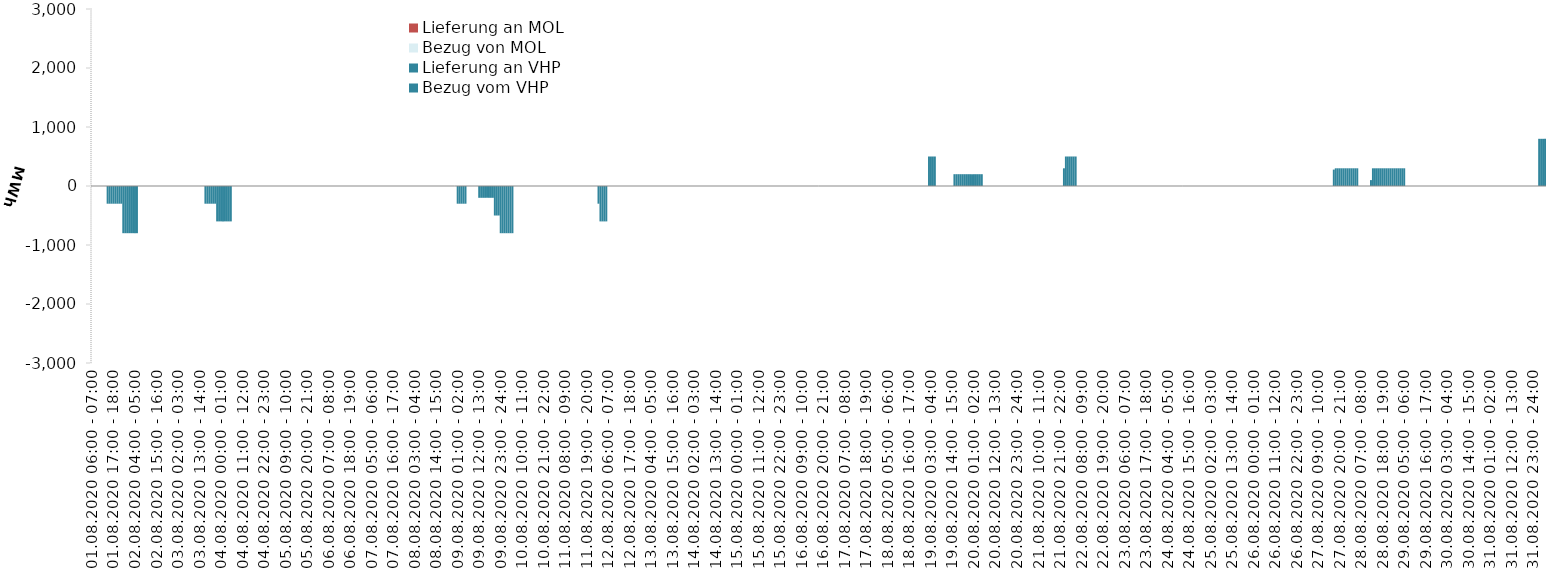
| Category | Bezug vom VHP | Lieferung an VHP | Bezug von MOL | Lieferung an MOL |
|---|---|---|---|---|
| 01.08.2020 06:00 - 07:00 | 0 | 0 | 0 | 0 |
| 01.08.2020 07:00 - 08:00 | 0 | 0 | 0 | 0 |
| 01.08.2020 08:00 - 09:00 | 0 | 0 | 0 | 0 |
| 01.08.2020 09:00 - 10:00 | 0 | 0 | 0 | 0 |
| 01.08.2020 10:00 - 11:00 | 0 | 0 | 0 | 0 |
| 01.08.2020 11:00 - 12:00 | 0 | 0 | 0 | 0 |
| 01.08.2020 12:00 - 13:00 | 0 | 0 | 0 | 0 |
| 01.08.2020 13:00 - 14:00 | 0 | 0 | 0 | 0 |
| 01.08.2020 14:00 - 15:00 | 0 | -300 | 0 | 0 |
| 01.08.2020 15:00 - 16:00 | 0 | -300 | 0 | 0 |
| 01.08.2020 16:00 - 17:00 | 0 | -300 | 0 | 0 |
| 01.08.2020 17:00 - 18:00 | 0 | -300 | 0 | 0 |
| 01.08.2020 18:00 - 19:00 | 0 | -300 | 0 | 0 |
| 01.08.2020 19:00 - 20:00 | 0 | -300 | 0 | 0 |
| 01.08.2020 20:00 - 21:00 | 0 | -300 | 0 | 0 |
| 01.08.2020 21:00 - 22:00 | 0 | -300 | 0 | 0 |
| 01.08.2020 22:00 - 23:00 | 0 | -800 | 0 | 0 |
| 01.08.2020 23:00 - 24:00 | 0 | -800 | 0 | 0 |
| 02.08.2020 00:00 - 01:00 | 0 | -800 | 0 | 0 |
| 02.08.2020 01:00 - 02:00 | 0 | -800 | 0 | 0 |
| 02.08.2020 02:00 - 03:00 | 0 | -800 | 0 | 0 |
| 02.08.2020 03:00 - 04:00 | 0 | -800 | 0 | 0 |
| 02.08.2020 04:00 - 05:00 | 0 | -800 | 0 | 0 |
| 02.08.2020 05:00 - 06:00 | 0 | -800 | 0 | 0 |
| 02.08.2020 06:00 - 07:00 | 0 | 0 | 0 | 0 |
| 02.08.2020 07:00 - 08:00 | 0 | 0 | 0 | 0 |
| 02.08.2020 08:00 - 09:00 | 0 | 0 | 0 | 0 |
| 02.08.2020 09:00 - 10:00 | 0 | 0 | 0 | 0 |
| 02.08.2020 10:00 - 11:00 | 0 | 0 | 0 | 0 |
| 02.08.2020 11:00 - 12:00 | 0 | 0 | 0 | 0 |
| 02.08.2020 12:00 - 13:00 | 0 | 0 | 0 | 0 |
| 02.08.2020 13:00 - 14:00 | 0 | 0 | 0 | 0 |
| 02.08.2020 14:00 - 15:00 | 0 | 0 | 0 | 0 |
| 02.08.2020 15:00 - 16:00 | 0 | 0 | 0 | 0 |
| 02.08.2020 16:00 - 17:00 | 0 | 0 | 0 | 0 |
| 02.08.2020 17:00 - 18:00 | 0 | 0 | 0 | 0 |
| 02.08.2020 18:00 - 19:00 | 0 | 0 | 0 | 0 |
| 02.08.2020 19:00 - 20:00 | 0 | 0 | 0 | 0 |
| 02.08.2020 20:00 - 21:00 | 0 | 0 | 0 | 0 |
| 02.08.2020 21:00 - 22:00 | 0 | 0 | 0 | 0 |
| 02.08.2020 22:00 - 23:00 | 0 | 0 | 0 | 0 |
| 02.08.2020 23:00 - 24:00 | 0 | 0 | 0 | 0 |
| 03.08.2020 00:00 - 01:00 | 0 | 0 | 0 | 0 |
| 03.08.2020 01:00 - 02:00 | 0 | 0 | 0 | 0 |
| 03.08.2020 02:00 - 03:00 | 0 | 0 | 0 | 0 |
| 03.08.2020 03:00 - 04:00 | 0 | 0 | 0 | 0 |
| 03.08.2020 04:00 - 05:00 | 0 | 0 | 0 | 0 |
| 03.08.2020 05:00 - 06:00 | 0 | 0 | 0 | 0 |
| 03.08.2020 06:00 - 07:00 | 0 | 0 | 0 | 0 |
| 03.08.2020 07:00 - 08:00 | 0 | 0 | 0 | 0 |
| 03.08.2020 08:00 - 09:00 | 0 | 0 | 0 | 0 |
| 03.08.2020 09:00 - 10:00 | 0 | 0 | 0 | 0 |
| 03.08.2020 10:00 - 11:00 | 0 | 0 | 0 | 0 |
| 03.08.2020 11:00 - 12:00 | 0 | 0 | 0 | 0 |
| 03.08.2020 12:00 - 13:00 | 0 | 0 | 0 | 0 |
| 03.08.2020 13:00 - 14:00 | 0 | 0 | 0 | 0 |
| 03.08.2020 14:00 - 15:00 | 0 | 0 | 0 | 0 |
| 03.08.2020 15:00 - 16:00 | 0 | 0 | 0 | 0 |
| 03.08.2020 16:00 - 17:00 | 0 | -300 | 0 | 0 |
| 03.08.2020 17:00 - 18:00 | 0 | -300 | 0 | 0 |
| 03.08.2020 18:00 - 19:00 | 0 | -300 | 0 | 0 |
| 03.08.2020 19:00 - 20:00 | 0 | -300 | 0 | 0 |
| 03.08.2020 20:00 - 21:00 | 0 | -300 | 0 | 0 |
| 03.08.2020 21:00 - 22:00 | 0 | -300 | 0 | 0 |
| 03.08.2020 22:00 - 23:00 | 0 | -600 | 0 | 0 |
| 03.08.2020 23:00 - 24:00 | 0 | -600 | 0 | 0 |
| 04.08.2020 00:00 - 01:00 | 0 | -600 | 0 | 0 |
| 04.08.2020 01:00 - 02:00 | 0 | -600 | 0 | 0 |
| 04.08.2020 02:00 - 03:00 | 0 | -600 | 0 | 0 |
| 04.08.2020 03:00 - 04:00 | 0 | -600 | 0 | 0 |
| 04.08.2020 04:00 - 05:00 | 0 | -600 | 0 | 0 |
| 04.08.2020 05:00 - 06:00 | 0 | -600 | 0 | 0 |
| 04.08.2020 06:00 - 07:00 | 0 | 0 | 0 | 0 |
| 04.08.2020 07:00 - 08:00 | 0 | 0 | 0 | 0 |
| 04.08.2020 08:00 - 09:00 | 0 | 0 | 0 | 0 |
| 04.08.2020 09:00 - 10:00 | 0 | 0 | 0 | 0 |
| 04.08.2020 10:00 - 11:00 | 0 | 0 | 0 | 0 |
| 04.08.2020 11:00 - 12:00 | 0 | 0 | 0 | 0 |
| 04.08.2020 12:00 - 13:00 | 0 | 0 | 0 | 0 |
| 04.08.2020 13:00 - 14:00 | 0 | 0 | 0 | 0 |
| 04.08.2020 14:00 - 15:00 | 0 | 0 | 0 | 0 |
| 04.08.2020 15:00 - 16:00 | 0 | 0 | 0 | 0 |
| 04.08.2020 16:00 - 17:00 | 0 | 0 | 0 | 0 |
| 04.08.2020 17:00 - 18:00 | 0 | 0 | 0 | 0 |
| 04.08.2020 18:00 - 19:00 | 0 | 0 | 0 | 0 |
| 04.08.2020 19:00 - 20:00 | 0 | 0 | 0 | 0 |
| 04.08.2020 20:00 - 21:00 | 0 | 0 | 0 | 0 |
| 04.08.2020 21:00 - 22:00 | 0 | 0 | 0 | 0 |
| 04.08.2020 22:00 - 23:00 | 0 | 0 | 0 | 0 |
| 04.08.2020 23:00 - 24:00 | 0 | 0 | 0 | 0 |
| 05.08.2020 00:00 - 01:00 | 0 | 0 | 0 | 0 |
| 05.08.2020 01:00 - 02:00 | 0 | 0 | 0 | 0 |
| 05.08.2020 02:00 - 03:00 | 0 | 0 | 0 | 0 |
| 05.08.2020 03:00 - 04:00 | 0 | 0 | 0 | 0 |
| 05.08.2020 04:00 - 05:00 | 0 | 0 | 0 | 0 |
| 05.08.2020 05:00 - 06:00 | 0 | 0 | 0 | 0 |
| 05.08.2020 06:00 - 07:00 | 0 | 0 | 0 | 0 |
| 05.08.2020 07:00 - 08:00 | 0 | 0 | 0 | 0 |
| 05.08.2020 08:00 - 09:00 | 0 | 0 | 0 | 0 |
| 05.08.2020 09:00 - 10:00 | 0 | 0 | 0 | 0 |
| 05.08.2020 10:00 - 11:00 | 0 | 0 | 0 | 0 |
| 05.08.2020 11:00 - 12:00 | 0 | 0 | 0 | 0 |
| 05.08.2020 12:00 - 13:00 | 0 | 0 | 0 | 0 |
| 05.08.2020 13:00 - 14:00 | 0 | 0 | 0 | 0 |
| 05.08.2020 14:00 - 15:00 | 0 | 0 | 0 | 0 |
| 05.08.2020 15:00 - 16:00 | 0 | 0 | 0 | 0 |
| 05.08.2020 16:00 - 17:00 | 0 | 0 | 0 | 0 |
| 05.08.2020 17:00 - 18:00 | 0 | 0 | 0 | 0 |
| 05.08.2020 18:00 - 19:00 | 0 | 0 | 0 | 0 |
| 05.08.2020 19:00 - 20:00 | 0 | 0 | 0 | 0 |
| 05.08.2020 20:00 - 21:00 | 0 | 0 | 0 | 0 |
| 05.08.2020 21:00 - 22:00 | 0 | 0 | 0 | 0 |
| 05.08.2020 22:00 - 23:00 | 0 | 0 | 0 | 0 |
| 05.08.2020 23:00 - 24:00 | 0 | 0 | 0 | 0 |
| 06.08.2020 00:00 - 01:00 | 0 | 0 | 0 | 0 |
| 06.08.2020 01:00 - 02:00 | 0 | 0 | 0 | 0 |
| 06.08.2020 02:00 - 03:00 | 0 | 0 | 0 | 0 |
| 06.08.2020 03:00 - 04:00 | 0 | 0 | 0 | 0 |
| 06.08.2020 04:00 - 05:00 | 0 | 0 | 0 | 0 |
| 06.08.2020 05:00 - 06:00 | 0 | 0 | 0 | 0 |
| 06.08.2020 06:00 - 07:00 | 0 | 0 | 0 | 0 |
| 06.08.2020 07:00 - 08:00 | 0 | 0 | 0 | 0 |
| 06.08.2020 08:00 - 09:00 | 0 | 0 | 0 | 0 |
| 06.08.2020 09:00 - 10:00 | 0 | 0 | 0 | 0 |
| 06.08.2020 10:00 - 11:00 | 0 | 0 | 0 | 0 |
| 06.08.2020 11:00 - 12:00 | 0 | 0 | 0 | 0 |
| 06.08.2020 12:00 - 13:00 | 0 | 0 | 0 | 0 |
| 06.08.2020 13:00 - 14:00 | 0 | 0 | 0 | 0 |
| 06.08.2020 14:00 - 15:00 | 0 | 0 | 0 | 0 |
| 06.08.2020 15:00 - 16:00 | 0 | 0 | 0 | 0 |
| 06.08.2020 16:00 - 17:00 | 0 | 0 | 0 | 0 |
| 06.08.2020 17:00 - 18:00 | 0 | 0 | 0 | 0 |
| 06.08.2020 18:00 - 19:00 | 0 | 0 | 0 | 0 |
| 06.08.2020 19:00 - 20:00 | 0 | 0 | 0 | 0 |
| 06.08.2020 20:00 - 21:00 | 0 | 0 | 0 | 0 |
| 06.08.2020 21:00 - 22:00 | 0 | 0 | 0 | 0 |
| 06.08.2020 22:00 - 23:00 | 0 | 0 | 0 | 0 |
| 06.08.2020 23:00 - 24:00 | 0 | 0 | 0 | 0 |
| 07.08.2020 00:00 - 01:00 | 0 | 0 | 0 | 0 |
| 07.08.2020 01:00 - 02:00 | 0 | 0 | 0 | 0 |
| 07.08.2020 02:00 - 03:00 | 0 | 0 | 0 | 0 |
| 07.08.2020 03:00 - 04:00 | 0 | 0 | 0 | 0 |
| 07.08.2020 04:00 - 05:00 | 0 | 0 | 0 | 0 |
| 07.08.2020 05:00 - 06:00 | 0 | 0 | 0 | 0 |
| 07.08.2020 06:00 - 07:00 | 0 | 0 | 0 | 0 |
| 07.08.2020 07:00 - 08:00 | 0 | 0 | 0 | 0 |
| 07.08.2020 08:00 - 09:00 | 0 | 0 | 0 | 0 |
| 07.08.2020 09:00 - 10:00 | 0 | 0 | 0 | 0 |
| 07.08.2020 10:00 - 11:00 | 0 | 0 | 0 | 0 |
| 07.08.2020 11:00 - 12:00 | 0 | 0 | 0 | 0 |
| 07.08.2020 12:00 - 13:00 | 0 | 0 | 0 | 0 |
| 07.08.2020 13:00 - 14:00 | 0 | 0 | 0 | 0 |
| 07.08.2020 14:00 - 15:00 | 0 | 0 | 0 | 0 |
| 07.08.2020 15:00 - 16:00 | 0 | 0 | 0 | 0 |
| 07.08.2020 16:00 - 17:00 | 0 | 0 | 0 | 0 |
| 07.08.2020 17:00 - 18:00 | 0 | 0 | 0 | 0 |
| 07.08.2020 18:00 - 19:00 | 0 | 0 | 0 | 0 |
| 07.08.2020 19:00 - 20:00 | 0 | 0 | 0 | 0 |
| 07.08.2020 20:00 - 21:00 | 0 | 0 | 0 | 0 |
| 07.08.2020 21:00 - 22:00 | 0 | 0 | 0 | 0 |
| 07.08.2020 22:00 - 23:00 | 0 | 0 | 0 | 0 |
| 07.08.2020 23:00 - 24:00 | 0 | 0 | 0 | 0 |
| 08.08.2020 00:00 - 01:00 | 0 | 0 | 0 | 0 |
| 08.08.2020 01:00 - 02:00 | 0 | 0 | 0 | 0 |
| 08.08.2020 02:00 - 03:00 | 0 | 0 | 0 | 0 |
| 08.08.2020 03:00 - 04:00 | 0 | 0 | 0 | 0 |
| 08.08.2020 04:00 - 05:00 | 0 | 0 | 0 | 0 |
| 08.08.2020 05:00 - 06:00 | 0 | 0 | 0 | 0 |
| 08.08.2020 06:00 - 07:00 | 0 | 0 | 0 | 0 |
| 08.08.2020 07:00 - 08:00 | 0 | 0 | 0 | 0 |
| 08.08.2020 08:00 - 09:00 | 0 | 0 | 0 | 0 |
| 08.08.2020 09:00 - 10:00 | 0 | 0 | 0 | 0 |
| 08.08.2020 10:00 - 11:00 | 0 | 0 | 0 | 0 |
| 08.08.2020 11:00 - 12:00 | 0 | 0 | 0 | 0 |
| 08.08.2020 12:00 - 13:00 | 0 | 0 | 0 | 0 |
| 08.08.2020 13:00 - 14:00 | 0 | 0 | 0 | 0 |
| 08.08.2020 14:00 - 15:00 | 0 | 0 | 0 | 0 |
| 08.08.2020 15:00 - 16:00 | 0 | 0 | 0 | 0 |
| 08.08.2020 16:00 - 17:00 | 0 | 0 | 0 | 0 |
| 08.08.2020 17:00 - 18:00 | 0 | 0 | 0 | 0 |
| 08.08.2020 18:00 - 19:00 | 0 | 0 | 0 | 0 |
| 08.08.2020 19:00 - 20:00 | 0 | 0 | 0 | 0 |
| 08.08.2020 20:00 - 21:00 | 0 | 0 | 0 | 0 |
| 08.08.2020 21:00 - 22:00 | 0 | 0 | 0 | 0 |
| 08.08.2020 22:00 - 23:00 | 0 | 0 | 0 | 0 |
| 08.08.2020 23:00 - 24:00 | 0 | 0 | 0 | 0 |
| 09.08.2020 00:00 - 01:00 | 0 | 0 | 0 | 0 |
| 09.08.2020 01:00 - 02:00 | 0 | -300 | 0 | 0 |
| 09.08.2020 02:00 - 03:00 | 0 | -300 | 0 | 0 |
| 09.08.2020 03:00 - 04:00 | 0 | -300 | 0 | 0 |
| 09.08.2020 04:00 - 05:00 | 0 | -300 | 0 | 0 |
| 09.08.2020 05:00 - 06:00 | 0 | -300 | 0 | 0 |
| 09.08.2020 06:00 - 07:00 | 0 | 0 | 0 | 0 |
| 09.08.2020 07:00 - 08:00 | 0 | 0 | 0 | 0 |
| 09.08.2020 08:00 - 09:00 | 0 | 0 | 0 | 0 |
| 09.08.2020 09:00 - 10:00 | 0 | 0 | 0 | 0 |
| 09.08.2020 10:00 - 11:00 | 0 | 0 | 0 | 0 |
| 09.08.2020 11:00 - 12:00 | 0 | 0 | 0 | 0 |
| 09.08.2020 12:00 - 13:00 | 0 | -200 | 0 | 0 |
| 09.08.2020 13:00 - 14:00 | 0 | -200 | 0 | 0 |
| 09.08.2020 14:00 - 15:00 | 0 | -200 | 0 | 0 |
| 09.08.2020 15:00 - 16:00 | 0 | -200 | 0 | 0 |
| 09.08.2020 16:00 - 17:00 | 0 | -200 | 0 | 0 |
| 09.08.2020 17:00 - 18:00 | 0 | -200 | 0 | 0 |
| 09.08.2020 18:00 - 19:00 | 0 | -200 | 0 | 0 |
| 09.08.2020 19:00 - 20:00 | 0 | -200 | 0 | 0 |
| 09.08.2020 20:00 - 21:00 | 0 | -500 | 0 | 0 |
| 09.08.2020 21:00 - 22:00 | 0 | -500 | 0 | 0 |
| 09.08.2020 22:00 - 23:00 | 0 | -500 | 0 | 0 |
| 09.08.2020 23:00 - 24:00 | 0 | -800 | 0 | 0 |
| 10.08.2020 00:00 - 01:00 | 0 | -800 | 0 | 0 |
| 10.08.2020 01:00 - 02:00 | 0 | -800 | 0 | 0 |
| 10.08.2020 02:00 - 03:00 | 0 | -800 | 0 | 0 |
| 10.08.2020 03:00 - 04:00 | 0 | -800 | 0 | 0 |
| 10.08.2020 04:00 - 05:00 | 0 | -800 | 0 | 0 |
| 10.08.2020 05:00 - 06:00 | 0 | -800 | 0 | 0 |
| 10.08.2020 06:00 - 07:00 | 0 | 0 | 0 | 0 |
| 10.08.2020 07:00 - 08:00 | 0 | 0 | 0 | 0 |
| 10.08.2020 08:00 - 09:00 | 0 | 0 | 0 | 0 |
| 10.08.2020 09:00 - 10:00 | 0 | 0 | 0 | 0 |
| 10.08.2020 10:00 - 11:00 | 0 | 0 | 0 | 0 |
| 10.08.2020 11:00 - 12:00 | 0 | 0 | 0 | 0 |
| 10.08.2020 12:00 - 13:00 | 0 | 0 | 0 | 0 |
| 10.08.2020 13:00 - 14:00 | 0 | 0 | 0 | 0 |
| 10.08.2020 14:00 - 15:00 | 0 | 0 | 0 | 0 |
| 10.08.2020 15:00 - 16:00 | 0 | 0 | 0 | 0 |
| 10.08.2020 16:00 - 17:00 | 0 | 0 | 0 | 0 |
| 10.08.2020 17:00 - 18:00 | 0 | 0 | 0 | 0 |
| 10.08.2020 18:00 - 19:00 | 0 | 0 | 0 | 0 |
| 10.08.2020 19:00 - 20:00 | 0 | 0 | 0 | 0 |
| 10.08.2020 20:00 - 21:00 | 0 | 0 | 0 | 0 |
| 10.08.2020 21:00 - 22:00 | 0 | 0 | 0 | 0 |
| 10.08.2020 22:00 - 23:00 | 0 | 0 | 0 | 0 |
| 10.08.2020 23:00 - 24:00 | 0 | 0 | 0 | 0 |
| 11.08.2020 00:00 - 01:00 | 0 | 0 | 0 | 0 |
| 11.08.2020 01:00 - 02:00 | 0 | 0 | 0 | 0 |
| 11.08.2020 02:00 - 03:00 | 0 | 0 | 0 | 0 |
| 11.08.2020 03:00 - 04:00 | 0 | 0 | 0 | 0 |
| 11.08.2020 04:00 - 05:00 | 0 | 0 | 0 | 0 |
| 11.08.2020 05:00 - 06:00 | 0 | 0 | 0 | 0 |
| 11.08.2020 06:00 - 07:00 | 0 | 0 | 0 | 0 |
| 11.08.2020 07:00 - 08:00 | 0 | 0 | 0 | 0 |
| 11.08.2020 08:00 - 09:00 | 0 | 0 | 0 | 0 |
| 11.08.2020 09:00 - 10:00 | 0 | 0 | 0 | 0 |
| 11.08.2020 10:00 - 11:00 | 0 | 0 | 0 | 0 |
| 11.08.2020 11:00 - 12:00 | 0 | 0 | 0 | 0 |
| 11.08.2020 12:00 - 13:00 | 0 | 0 | 0 | 0 |
| 11.08.2020 13:00 - 14:00 | 0 | 0 | 0 | 0 |
| 11.08.2020 14:00 - 15:00 | 0 | 0 | 0 | 0 |
| 11.08.2020 15:00 - 16:00 | 0 | 0 | 0 | 0 |
| 11.08.2020 16:00 - 17:00 | 0 | 0 | 0 | 0 |
| 11.08.2020 17:00 - 18:00 | 0 | 0 | 0 | 0 |
| 11.08.2020 18:00 - 19:00 | 0 | 0 | 0 | 0 |
| 11.08.2020 19:00 - 20:00 | 0 | 0 | 0 | 0 |
| 11.08.2020 20:00 - 21:00 | 0 | 0 | 0 | 0 |
| 11.08.2020 21:00 - 22:00 | 0 | 0 | 0 | 0 |
| 11.08.2020 22:00 - 23:00 | 0 | 0 | 0 | 0 |
| 11.08.2020 23:00 - 24:00 | 0 | 0 | 0 | 0 |
| 12.08.2020 00:00 - 01:00 | 0 | 0 | 0 | 0 |
| 12.08.2020 01:00 - 02:00 | 0 | -300 | 0 | 0 |
| 12.08.2020 02:00 - 03:00 | 0 | -600 | 0 | 0 |
| 12.08.2020 03:00 - 04:00 | 0 | -600 | 0 | 0 |
| 12.08.2020 04:00 - 05:00 | 0 | -600 | 0 | 0 |
| 12.08.2020 05:00 - 06:00 | 0 | -600 | 0 | 0 |
| 12.08.2020 06:00 - 07:00 | 0 | 0 | 0 | 0 |
| 12.08.2020 07:00 - 08:00 | 0 | 0 | 0 | 0 |
| 12.08.2020 08:00 - 09:00 | 0 | 0 | 0 | 0 |
| 12.08.2020 09:00 - 10:00 | 0 | 0 | 0 | 0 |
| 12.08.2020 10:00 - 11:00 | 0 | 0 | 0 | 0 |
| 12.08.2020 11:00 - 12:00 | 0 | 0 | 0 | 0 |
| 12.08.2020 12:00 - 13:00 | 0 | 0 | 0 | 0 |
| 12.08.2020 13:00 - 14:00 | 0 | 0 | 0 | 0 |
| 12.08.2020 14:00 - 15:00 | 0 | 0 | 0 | 0 |
| 12.08.2020 15:00 - 16:00 | 0 | 0 | 0 | 0 |
| 12.08.2020 16:00 - 17:00 | 0 | 0 | 0 | 0 |
| 12.08.2020 17:00 - 18:00 | 0 | 0 | 0 | 0 |
| 12.08.2020 18:00 - 19:00 | 0 | 0 | 0 | 0 |
| 12.08.2020 19:00 - 20:00 | 0 | 0 | 0 | 0 |
| 12.08.2020 20:00 - 21:00 | 0 | 0 | 0 | 0 |
| 12.08.2020 21:00 - 22:00 | 0 | 0 | 0 | 0 |
| 12.08.2020 22:00 - 23:00 | 0 | 0 | 0 | 0 |
| 12.08.2020 23:00 - 24:00 | 0 | 0 | 0 | 0 |
| 13.08.2020 00:00 - 01:00 | 0 | 0 | 0 | 0 |
| 13.08.2020 01:00 - 02:00 | 0 | 0 | 0 | 0 |
| 13.08.2020 02:00 - 03:00 | 0 | 0 | 0 | 0 |
| 13.08.2020 03:00 - 04:00 | 0 | 0 | 0 | 0 |
| 13.08.2020 04:00 - 05:00 | 0 | 0 | 0 | 0 |
| 13.08.2020 05:00 - 06:00 | 0 | 0 | 0 | 0 |
| 13.08.2020 06:00 - 07:00 | 0 | 0 | 0 | 0 |
| 13.08.2020 07:00 - 08:00 | 0 | 0 | 0 | 0 |
| 13.08.2020 08:00 - 09:00 | 0 | 0 | 0 | 0 |
| 13.08.2020 09:00 - 10:00 | 0 | 0 | 0 | 0 |
| 13.08.2020 10:00 - 11:00 | 0 | 0 | 0 | 0 |
| 13.08.2020 11:00 - 12:00 | 0 | 0 | 0 | 0 |
| 13.08.2020 12:00 - 13:00 | 0 | 0 | 0 | 0 |
| 13.08.2020 13:00 - 14:00 | 0 | 0 | 0 | 0 |
| 13.08.2020 14:00 - 15:00 | 0 | 0 | 0 | 0 |
| 13.08.2020 15:00 - 16:00 | 0 | 0 | 0 | 0 |
| 13.08.2020 16:00 - 17:00 | 0 | 0 | 0 | 0 |
| 13.08.2020 17:00 - 18:00 | 0 | 0 | 0 | 0 |
| 13.08.2020 18:00 - 19:00 | 0 | 0 | 0 | 0 |
| 13.08.2020 19:00 - 20:00 | 0 | 0 | 0 | 0 |
| 13.08.2020 20:00 - 21:00 | 0 | 0 | 0 | 0 |
| 13.08.2020 21:00 - 22:00 | 0 | 0 | 0 | 0 |
| 13.08.2020 22:00 - 23:00 | 0 | 0 | 0 | 0 |
| 13.08.2020 23:00 - 24:00 | 0 | 0 | 0 | 0 |
| 14.08.2020 00:00 - 01:00 | 0 | 0 | 0 | 0 |
| 14.08.2020 01:00 - 02:00 | 0 | 0 | 0 | 0 |
| 14.08.2020 02:00 - 03:00 | 0 | 0 | 0 | 0 |
| 14.08.2020 03:00 - 04:00 | 0 | 0 | 0 | 0 |
| 14.08.2020 04:00 - 05:00 | 0 | 0 | 0 | 0 |
| 14.08.2020 05:00 - 06:00 | 0 | 0 | 0 | 0 |
| 14.08.2020 06:00 - 07:00 | 0 | 0 | 0 | 0 |
| 14.08.2020 07:00 - 08:00 | 0 | 0 | 0 | 0 |
| 14.08.2020 08:00 - 09:00 | 0 | 0 | 0 | 0 |
| 14.08.2020 09:00 - 10:00 | 0 | 0 | 0 | 0 |
| 14.08.2020 10:00 - 11:00 | 0 | 0 | 0 | 0 |
| 14.08.2020 11:00 - 12:00 | 0 | 0 | 0 | 0 |
| 14.08.2020 12:00 - 13:00 | 0 | 0 | 0 | 0 |
| 14.08.2020 13:00 - 14:00 | 0 | 0 | 0 | 0 |
| 14.08.2020 14:00 - 15:00 | 0 | 0 | 0 | 0 |
| 14.08.2020 15:00 - 16:00 | 0 | 0 | 0 | 0 |
| 14.08.2020 16:00 - 17:00 | 0 | 0 | 0 | 0 |
| 14.08.2020 17:00 - 18:00 | 0 | 0 | 0 | 0 |
| 14.08.2020 18:00 - 19:00 | 0 | 0 | 0 | 0 |
| 14.08.2020 19:00 - 20:00 | 0 | 0 | 0 | 0 |
| 14.08.2020 20:00 - 21:00 | 0 | 0 | 0 | 0 |
| 14.08.2020 21:00 - 22:00 | 0 | 0 | 0 | 0 |
| 14.08.2020 22:00 - 23:00 | 0 | 0 | 0 | 0 |
| 14.08.2020 23:00 - 24:00 | 0 | 0 | 0 | 0 |
| 15.08.2020 00:00 - 01:00 | 0 | 0 | 0 | 0 |
| 15.08.2020 01:00 - 02:00 | 0 | 0 | 0 | 0 |
| 15.08.2020 02:00 - 03:00 | 0 | 0 | 0 | 0 |
| 15.08.2020 03:00 - 04:00 | 0 | 0 | 0 | 0 |
| 15.08.2020 04:00 - 05:00 | 0 | 0 | 0 | 0 |
| 15.08.2020 05:00 - 06:00 | 0 | 0 | 0 | 0 |
| 15.08.2020 06:00 - 07:00 | 0 | 0 | 0 | 0 |
| 15.08.2020 07:00 - 08:00 | 0 | 0 | 0 | 0 |
| 15.08.2020 08:00 - 09:00 | 0 | 0 | 0 | 0 |
| 15.08.2020 09:00 - 10:00 | 0 | 0 | 0 | 0 |
| 15.08.2020 10:00 - 11:00 | 0 | 0 | 0 | 0 |
| 15.08.2020 11:00 - 12:00 | 0 | 0 | 0 | 0 |
| 15.08.2020 12:00 - 13:00 | 0 | 0 | 0 | 0 |
| 15.08.2020 13:00 - 14:00 | 0 | 0 | 0 | 0 |
| 15.08.2020 14:00 - 15:00 | 0 | 0 | 0 | 0 |
| 15.08.2020 15:00 - 16:00 | 0 | 0 | 0 | 0 |
| 15.08.2020 16:00 - 17:00 | 0 | 0 | 0 | 0 |
| 15.08.2020 17:00 - 18:00 | 0 | 0 | 0 | 0 |
| 15.08.2020 18:00 - 19:00 | 0 | 0 | 0 | 0 |
| 15.08.2020 19:00 - 20:00 | 0 | 0 | 0 | 0 |
| 15.08.2020 20:00 - 21:00 | 0 | 0 | 0 | 0 |
| 15.08.2020 21:00 - 22:00 | 0 | 0 | 0 | 0 |
| 15.08.2020 22:00 - 23:00 | 0 | 0 | 0 | 0 |
| 15.08.2020 23:00 - 24:00 | 0 | 0 | 0 | 0 |
| 16.08.2020 00:00 - 01:00 | 0 | 0 | 0 | 0 |
| 16.08.2020 01:00 - 02:00 | 0 | 0 | 0 | 0 |
| 16.08.2020 02:00 - 03:00 | 0 | 0 | 0 | 0 |
| 16.08.2020 03:00 - 04:00 | 0 | 0 | 0 | 0 |
| 16.08.2020 04:00 - 05:00 | 0 | 0 | 0 | 0 |
| 16.08.2020 05:00 - 06:00 | 0 | 0 | 0 | 0 |
| 16.08.2020 06:00 - 07:00 | 0 | 0 | 0 | 0 |
| 16.08.2020 07:00 - 08:00 | 0 | 0 | 0 | 0 |
| 16.08.2020 08:00 - 09:00 | 0 | 0 | 0 | 0 |
| 16.08.2020 09:00 - 10:00 | 0 | 0 | 0 | 0 |
| 16.08.2020 10:00 - 11:00 | 0 | 0 | 0 | 0 |
| 16.08.2020 11:00 - 12:00 | 0 | 0 | 0 | 0 |
| 16.08.2020 12:00 - 13:00 | 0 | 0 | 0 | 0 |
| 16.08.2020 13:00 - 14:00 | 0 | 0 | 0 | 0 |
| 16.08.2020 14:00 - 15:00 | 0 | 0 | 0 | 0 |
| 16.08.2020 15:00 - 16:00 | 0 | 0 | 0 | 0 |
| 16.08.2020 16:00 - 17:00 | 0 | 0 | 0 | 0 |
| 16.08.2020 17:00 - 18:00 | 0 | 0 | 0 | 0 |
| 16.08.2020 18:00 - 19:00 | 0 | 0 | 0 | 0 |
| 16.08.2020 19:00 - 20:00 | 0 | 0 | 0 | 0 |
| 16.08.2020 20:00 - 21:00 | 0 | 0 | 0 | 0 |
| 16.08.2020 21:00 - 22:00 | 0 | 0 | 0 | 0 |
| 16.08.2020 22:00 - 23:00 | 0 | 0 | 0 | 0 |
| 16.08.2020 23:00 - 24:00 | 0 | 0 | 0 | 0 |
| 17.08.2020 00:00 - 01:00 | 0 | 0 | 0 | 0 |
| 17.08.2020 01:00 - 02:00 | 0 | 0 | 0 | 0 |
| 17.08.2020 02:00 - 03:00 | 0 | 0 | 0 | 0 |
| 17.08.2020 03:00 - 04:00 | 0 | 0 | 0 | 0 |
| 17.08.2020 04:00 - 05:00 | 0 | 0 | 0 | 0 |
| 17.08.2020 05:00 - 06:00 | 0 | 0 | 0 | 0 |
| 17.08.2020 06:00 - 07:00 | 0 | 0 | 0 | 0 |
| 17.08.2020 07:00 - 08:00 | 0 | 0 | 0 | 0 |
| 17.08.2020 08:00 - 09:00 | 0 | 0 | 0 | 0 |
| 17.08.2020 09:00 - 10:00 | 0 | 0 | 0 | 0 |
| 17.08.2020 10:00 - 11:00 | 0 | 0 | 0 | 0 |
| 17.08.2020 11:00 - 12:00 | 0 | 0 | 0 | 0 |
| 17.08.2020 12:00 - 13:00 | 0 | 0 | 0 | 0 |
| 17.08.2020 13:00 - 14:00 | 0 | 0 | 0 | 0 |
| 17.08.2020 14:00 - 15:00 | 0 | 0 | 0 | 0 |
| 17.08.2020 15:00 - 16:00 | 0 | 0 | 0 | 0 |
| 17.08.2020 16:00 - 17:00 | 0 | 0 | 0 | 0 |
| 17.08.2020 17:00 - 18:00 | 0 | 0 | 0 | 0 |
| 17.08.2020 18:00 - 19:00 | 0 | 0 | 0 | 0 |
| 17.08.2020 19:00 - 20:00 | 0 | 0 | 0 | 0 |
| 17.08.2020 20:00 - 21:00 | 0 | 0 | 0 | 0 |
| 17.08.2020 21:00 - 22:00 | 0 | 0 | 0 | 0 |
| 17.08.2020 22:00 - 23:00 | 0 | 0 | 0 | 0 |
| 17.08.2020 23:00 - 24:00 | 0 | 0 | 0 | 0 |
| 18.08.2020 00:00 - 01:00 | 0 | 0 | 0 | 0 |
| 18.08.2020 01:00 - 02:00 | 0 | 0 | 0 | 0 |
| 18.08.2020 02:00 - 03:00 | 0 | 0 | 0 | 0 |
| 18.08.2020 03:00 - 04:00 | 0 | 0 | 0 | 0 |
| 18.08.2020 04:00 - 05:00 | 0 | 0 | 0 | 0 |
| 18.08.2020 05:00 - 06:00 | 0 | 0 | 0 | 0 |
| 18.08.2020 06:00 - 07:00 | 0 | 0 | 0 | 0 |
| 18.08.2020 07:00 - 08:00 | 0 | 0 | 0 | 0 |
| 18.08.2020 08:00 - 09:00 | 0 | 0 | 0 | 0 |
| 18.08.2020 09:00 - 10:00 | 0 | 0 | 0 | 0 |
| 18.08.2020 10:00 - 11:00 | 0 | 0 | 0 | 0 |
| 18.08.2020 11:00 - 12:00 | 0 | 0 | 0 | 0 |
| 18.08.2020 12:00 - 13:00 | 0 | 0 | 0 | 0 |
| 18.08.2020 13:00 - 14:00 | 0 | 0 | 0 | 0 |
| 18.08.2020 14:00 - 15:00 | 0 | 0 | 0 | 0 |
| 18.08.2020 15:00 - 16:00 | 0 | 0 | 0 | 0 |
| 18.08.2020 16:00 - 17:00 | 0 | 0 | 0 | 0 |
| 18.08.2020 17:00 - 18:00 | 0 | 0 | 0 | 0 |
| 18.08.2020 18:00 - 19:00 | 0 | 0 | 0 | 0 |
| 18.08.2020 19:00 - 20:00 | 0 | 0 | 0 | 0 |
| 18.08.2020 20:00 - 21:00 | 0 | 0 | 0 | 0 |
| 18.08.2020 21:00 - 22:00 | 0 | 0 | 0 | 0 |
| 18.08.2020 22:00 - 23:00 | 0 | 0 | 0 | 0 |
| 18.08.2020 23:00 - 24:00 | 0 | 0 | 0 | 0 |
| 19.08.2020 00:00 - 01:00 | 0 | 0 | 0 | 0 |
| 19.08.2020 01:00 - 02:00 | 0 | 0 | 0 | 0 |
| 19.08.2020 02:00 - 03:00 | 500 | 0 | 0 | 0 |
| 19.08.2020 03:00 - 04:00 | 500 | 0 | 0 | 0 |
| 19.08.2020 04:00 - 05:00 | 500 | 0 | 0 | 0 |
| 19.08.2020 05:00 - 06:00 | 500 | 0 | 0 | 0 |
| 19.08.2020 06:00 - 07:00 | 0 | 0 | 0 | 0 |
| 19.08.2020 07:00 - 08:00 | 0 | 0 | 0 | 0 |
| 19.08.2020 08:00 - 09:00 | 0 | 0 | 0 | 0 |
| 19.08.2020 09:00 - 10:00 | 0 | 0 | 0 | 0 |
| 19.08.2020 10:00 - 11:00 | 0 | 0 | 0 | 0 |
| 19.08.2020 11:00 - 12:00 | 0 | 0 | 0 | 0 |
| 19.08.2020 12:00 - 13:00 | 0 | 0 | 0 | 0 |
| 19.08.2020 13:00 - 14:00 | 0 | 0 | 0 | 0 |
| 19.08.2020 14:00 - 15:00 | 0 | 0 | 0 | 0 |
| 19.08.2020 15:00 - 16:00 | 200 | 0 | 0 | 0 |
| 19.08.2020 16:00 - 17:00 | 200 | 0 | 0 | 0 |
| 19.08.2020 17:00 - 18:00 | 200 | 0 | 0 | 0 |
| 19.08.2020 18:00 - 19:00 | 200 | 0 | 0 | 0 |
| 19.08.2020 19:00 - 20:00 | 200 | 0 | 0 | 0 |
| 19.08.2020 20:00 - 21:00 | 200 | 0 | 0 | 0 |
| 19.08.2020 21:00 - 22:00 | 200 | 0 | 0 | 0 |
| 19.08.2020 22:00 - 23:00 | 200 | 0 | 0 | 0 |
| 19.08.2020 23:00 - 24:00 | 200 | 0 | 0 | 0 |
| 20.08.2020 00:00 - 01:00 | 200 | 0 | 0 | 0 |
| 20.08.2020 01:00 - 02:00 | 200 | 0 | 0 | 0 |
| 20.08.2020 02:00 - 03:00 | 200 | 0 | 0 | 0 |
| 20.08.2020 03:00 - 04:00 | 200 | 0 | 0 | 0 |
| 20.08.2020 04:00 - 05:00 | 200 | 0 | 0 | 0 |
| 20.08.2020 05:00 - 06:00 | 200 | 0 | 0 | 0 |
| 20.08.2020 06:00 - 07:00 | 0 | 0 | 0 | 0 |
| 20.08.2020 07:00 - 08:00 | 0 | 0 | 0 | 0 |
| 20.08.2020 08:00 - 09:00 | 0 | 0 | 0 | 0 |
| 20.08.2020 09:00 - 10:00 | 0 | 0 | 0 | 0 |
| 20.08.2020 10:00 - 11:00 | 0 | 0 | 0 | 0 |
| 20.08.2020 11:00 - 12:00 | 0 | 0 | 0 | 0 |
| 20.08.2020 12:00 - 13:00 | 0 | 0 | 0 | 0 |
| 20.08.2020 13:00 - 14:00 | 0 | 0 | 0 | 0 |
| 20.08.2020 14:00 - 15:00 | 0 | 0 | 0 | 0 |
| 20.08.2020 15:00 - 16:00 | 0 | 0 | 0 | 0 |
| 20.08.2020 16:00 - 17:00 | 0 | 0 | 0 | 0 |
| 20.08.2020 17:00 - 18:00 | 0 | 0 | 0 | 0 |
| 20.08.2020 18:00 - 19:00 | 0 | 0 | 0 | 0 |
| 20.08.2020 19:00 - 20:00 | 0 | 0 | 0 | 0 |
| 20.08.2020 20:00 - 21:00 | 0 | 0 | 0 | 0 |
| 20.08.2020 21:00 - 22:00 | 0 | 0 | 0 | 0 |
| 20.08.2020 22:00 - 23:00 | 0 | 0 | 0 | 0 |
| 20.08.2020 23:00 - 24:00 | 0 | 0 | 0 | 0 |
| 21.08.2020 00:00 - 01:00 | 0 | 0 | 0 | 0 |
| 21.08.2020 01:00 - 02:00 | 0 | 0 | 0 | 0 |
| 21.08.2020 02:00 - 03:00 | 0 | 0 | 0 | 0 |
| 21.08.2020 03:00 - 04:00 | 0 | 0 | 0 | 0 |
| 21.08.2020 04:00 - 05:00 | 0 | 0 | 0 | 0 |
| 21.08.2020 05:00 - 06:00 | 0 | 0 | 0 | 0 |
| 21.08.2020 06:00 - 07:00 | 0 | 0 | 0 | 0 |
| 21.08.2020 07:00 - 08:00 | 0 | 0 | 0 | 0 |
| 21.08.2020 08:00 - 09:00 | 0 | 0 | 0 | 0 |
| 21.08.2020 09:00 - 10:00 | 0 | 0 | 0 | 0 |
| 21.08.2020 10:00 - 11:00 | 0 | 0 | 0 | 0 |
| 21.08.2020 11:00 - 12:00 | 0 | 0 | 0 | 0 |
| 21.08.2020 12:00 - 13:00 | 0 | 0 | 0 | 0 |
| 21.08.2020 13:00 - 14:00 | 0 | 0 | 0 | 0 |
| 21.08.2020 14:00 - 15:00 | 0 | 0 | 0 | 0 |
| 21.08.2020 15:00 - 16:00 | 0 | 0 | 0 | 0 |
| 21.08.2020 16:00 - 17:00 | 0 | 0 | 0 | 0 |
| 21.08.2020 17:00 - 18:00 | 0 | 0 | 0 | 0 |
| 21.08.2020 18:00 - 19:00 | 0 | 0 | 0 | 0 |
| 21.08.2020 19:00 - 20:00 | 0 | 0 | 0 | 0 |
| 21.08.2020 20:00 - 21:00 | 0 | 0 | 0 | 0 |
| 21.08.2020 21:00 - 22:00 | 0 | 0 | 0 | 0 |
| 21.08.2020 22:00 - 23:00 | 0 | 0 | 0 | 0 |
| 21.08.2020 23:00 - 24:00 | 300 | 0 | 0 | 0 |
| 22.08.2020 00:00 - 01:00 | 500 | 0 | 0 | 0 |
| 22.08.2020 01:00 - 02:00 | 500 | 0 | 0 | 0 |
| 22.08.2020 02:00 - 03:00 | 500 | 0 | 0 | 0 |
| 22.08.2020 03:00 - 04:00 | 500 | 0 | 0 | 0 |
| 22.08.2020 04:00 - 05:00 | 500 | 0 | 0 | 0 |
| 22.08.2020 05:00 - 06:00 | 500 | 0 | 0 | 0 |
| 22.08.2020 06:00 - 07:00 | 0 | 0 | 0 | 0 |
| 22.08.2020 07:00 - 08:00 | 0 | 0 | 0 | 0 |
| 22.08.2020 08:00 - 09:00 | 0 | 0 | 0 | 0 |
| 22.08.2020 09:00 - 10:00 | 0 | 0 | 0 | 0 |
| 22.08.2020 10:00 - 11:00 | 0 | 0 | 0 | 0 |
| 22.08.2020 11:00 - 12:00 | 0 | 0 | 0 | 0 |
| 22.08.2020 12:00 - 13:00 | 0 | 0 | 0 | 0 |
| 22.08.2020 13:00 - 14:00 | 0 | 0 | 0 | 0 |
| 22.08.2020 14:00 - 15:00 | 0 | 0 | 0 | 0 |
| 22.08.2020 15:00 - 16:00 | 0 | 0 | 0 | 0 |
| 22.08.2020 16:00 - 17:00 | 0 | 0 | 0 | 0 |
| 22.08.2020 17:00 - 18:00 | 0 | 0 | 0 | 0 |
| 22.08.2020 18:00 - 19:00 | 0 | 0 | 0 | 0 |
| 22.08.2020 19:00 - 20:00 | 0 | 0 | 0 | 0 |
| 22.08.2020 20:00 - 21:00 | 0 | 0 | 0 | 0 |
| 22.08.2020 21:00 - 22:00 | 0 | 0 | 0 | 0 |
| 22.08.2020 22:00 - 23:00 | 0 | 0 | 0 | 0 |
| 22.08.2020 23:00 - 24:00 | 0 | 0 | 0 | 0 |
| 23.08.2020 00:00 - 01:00 | 0 | 0 | 0 | 0 |
| 23.08.2020 01:00 - 02:00 | 0 | 0 | 0 | 0 |
| 23.08.2020 02:00 - 03:00 | 0 | 0 | 0 | 0 |
| 23.08.2020 03:00 - 04:00 | 0 | 0 | 0 | 0 |
| 23.08.2020 04:00 - 05:00 | 0 | 0 | 0 | 0 |
| 23.08.2020 05:00 - 06:00 | 0 | 0 | 0 | 0 |
| 23.08.2020 06:00 - 07:00 | 0 | 0 | 0 | 0 |
| 23.08.2020 07:00 - 08:00 | 0 | 0 | 0 | 0 |
| 23.08.2020 08:00 - 09:00 | 0 | 0 | 0 | 0 |
| 23.08.2020 09:00 - 10:00 | 0 | 0 | 0 | 0 |
| 23.08.2020 10:00 - 11:00 | 0 | 0 | 0 | 0 |
| 23.08.2020 11:00 - 12:00 | 0 | 0 | 0 | 0 |
| 23.08.2020 12:00 - 13:00 | 0 | 0 | 0 | 0 |
| 23.08.2020 13:00 - 14:00 | 0 | 0 | 0 | 0 |
| 23.08.2020 14:00 - 15:00 | 0 | 0 | 0 | 0 |
| 23.08.2020 15:00 - 16:00 | 0 | 0 | 0 | 0 |
| 23.08.2020 16:00 - 17:00 | 0 | 0 | 0 | 0 |
| 23.08.2020 17:00 - 18:00 | 0 | 0 | 0 | 0 |
| 23.08.2020 18:00 - 19:00 | 0 | 0 | 0 | 0 |
| 23.08.2020 19:00 - 20:00 | 0 | 0 | 0 | 0 |
| 23.08.2020 20:00 - 21:00 | 0 | 0 | 0 | 0 |
| 23.08.2020 21:00 - 22:00 | 0 | 0 | 0 | 0 |
| 23.08.2020 22:00 - 23:00 | 0 | 0 | 0 | 0 |
| 23.08.2020 23:00 - 24:00 | 0 | 0 | 0 | 0 |
| 24.08.2020 00:00 - 01:00 | 0 | 0 | 0 | 0 |
| 24.08.2020 01:00 - 02:00 | 0 | 0 | 0 | 0 |
| 24.08.2020 02:00 - 03:00 | 0 | 0 | 0 | 0 |
| 24.08.2020 03:00 - 04:00 | 0 | 0 | 0 | 0 |
| 24.08.2020 04:00 - 05:00 | 0 | 0 | 0 | 0 |
| 24.08.2020 05:00 - 06:00 | 0 | 0 | 0 | 0 |
| 24.08.2020 06:00 - 07:00 | 0 | 0 | 0 | 0 |
| 24.08.2020 07:00 - 08:00 | 0 | 0 | 0 | 0 |
| 24.08.2020 08:00 - 09:00 | 0 | 0 | 0 | 0 |
| 24.08.2020 09:00 - 10:00 | 0 | 0 | 0 | 0 |
| 24.08.2020 10:00 - 11:00 | 0 | 0 | 0 | 0 |
| 24.08.2020 11:00 - 12:00 | 0 | 0 | 0 | 0 |
| 24.08.2020 12:00 - 13:00 | 0 | 0 | 0 | 0 |
| 24.08.2020 13:00 - 14:00 | 0 | 0 | 0 | 0 |
| 24.08.2020 14:00 - 15:00 | 0 | 0 | 0 | 0 |
| 24.08.2020 15:00 - 16:00 | 0 | 0 | 0 | 0 |
| 24.08.2020 16:00 - 17:00 | 0 | 0 | 0 | 0 |
| 24.08.2020 17:00 - 18:00 | 0 | 0 | 0 | 0 |
| 24.08.2020 18:00 - 19:00 | 0 | 0 | 0 | 0 |
| 24.08.2020 19:00 - 20:00 | 0 | 0 | 0 | 0 |
| 24.08.2020 20:00 - 21:00 | 0 | 0 | 0 | 0 |
| 24.08.2020 21:00 - 22:00 | 0 | 0 | 0 | 0 |
| 24.08.2020 22:00 - 23:00 | 0 | 0 | 0 | 0 |
| 24.08.2020 23:00 - 24:00 | 0 | 0 | 0 | 0 |
| 25.08.2020 00:00 - 01:00 | 0 | 0 | 0 | 0 |
| 25.08.2020 01:00 - 02:00 | 0 | 0 | 0 | 0 |
| 25.08.2020 02:00 - 03:00 | 0 | 0 | 0 | 0 |
| 25.08.2020 03:00 - 04:00 | 0 | 0 | 0 | 0 |
| 25.08.2020 04:00 - 05:00 | 0 | 0 | 0 | 0 |
| 25.08.2020 05:00 - 06:00 | 0 | 0 | 0 | 0 |
| 25.08.2020 06:00 - 07:00 | 0 | 0 | 0 | 0 |
| 25.08.2020 07:00 - 08:00 | 0 | 0 | 0 | 0 |
| 25.08.2020 08:00 - 09:00 | 0 | 0 | 0 | 0 |
| 25.08.2020 09:00 - 10:00 | 0 | 0 | 0 | 0 |
| 25.08.2020 10:00 - 11:00 | 0 | 0 | 0 | 0 |
| 25.08.2020 11:00 - 12:00 | 0 | 0 | 0 | 0 |
| 25.08.2020 12:00 - 13:00 | 0 | 0 | 0 | 0 |
| 25.08.2020 13:00 - 14:00 | 0 | 0 | 0 | 0 |
| 25.08.2020 14:00 - 15:00 | 0 | 0 | 0 | 0 |
| 25.08.2020 15:00 - 16:00 | 0 | 0 | 0 | 0 |
| 25.08.2020 16:00 - 17:00 | 0 | 0 | 0 | 0 |
| 25.08.2020 17:00 - 18:00 | 0 | 0 | 0 | 0 |
| 25.08.2020 18:00 - 19:00 | 0 | 0 | 0 | 0 |
| 25.08.2020 19:00 - 20:00 | 0 | 0 | 0 | 0 |
| 25.08.2020 20:00 - 21:00 | 0 | 0 | 0 | 0 |
| 25.08.2020 21:00 - 22:00 | 0 | 0 | 0 | 0 |
| 25.08.2020 22:00 - 23:00 | 0 | 0 | 0 | 0 |
| 25.08.2020 23:00 - 24:00 | 0 | 0 | 0 | 0 |
| 26.08.2020 00:00 - 01:00 | 0 | 0 | 0 | 0 |
| 26.08.2020 01:00 - 02:00 | 0 | 0 | 0 | 0 |
| 26.08.2020 02:00 - 03:00 | 0 | 0 | 0 | 0 |
| 26.08.2020 03:00 - 04:00 | 0 | 0 | 0 | 0 |
| 26.08.2020 04:00 - 05:00 | 0 | 0 | 0 | 0 |
| 26.08.2020 05:00 - 06:00 | 0 | 0 | 0 | 0 |
| 26.08.2020 06:00 - 07:00 | 0 | 0 | 0 | 0 |
| 26.08.2020 07:00 - 08:00 | 0 | 0 | 0 | 0 |
| 26.08.2020 08:00 - 09:00 | 0 | 0 | 0 | 0 |
| 26.08.2020 09:00 - 10:00 | 0 | 0 | 0 | 0 |
| 26.08.2020 10:00 - 11:00 | 0 | 0 | 0 | 0 |
| 26.08.2020 11:00 - 12:00 | 0 | 0 | 0 | 0 |
| 26.08.2020 12:00 - 13:00 | 0 | 0 | 0 | 0 |
| 26.08.2020 13:00 - 14:00 | 0 | 0 | 0 | 0 |
| 26.08.2020 14:00 - 15:00 | 0 | 0 | 0 | 0 |
| 26.08.2020 15:00 - 16:00 | 0 | 0 | 0 | 0 |
| 26.08.2020 16:00 - 17:00 | 0 | 0 | 0 | 0 |
| 26.08.2020 17:00 - 18:00 | 0 | 0 | 0 | 0 |
| 26.08.2020 18:00 - 19:00 | 0 | 0 | 0 | 0 |
| 26.08.2020 19:00 - 20:00 | 0 | 0 | 0 | 0 |
| 26.08.2020 20:00 - 21:00 | 0 | 0 | 0 | 0 |
| 26.08.2020 21:00 - 22:00 | 0 | 0 | 0 | 0 |
| 26.08.2020 22:00 - 23:00 | 0 | 0 | 0 | 0 |
| 26.08.2020 23:00 - 24:00 | 0 | 0 | 0 | 0 |
| 27.08.2020 00:00 - 01:00 | 0 | 0 | 0 | 0 |
| 27.08.2020 01:00 - 02:00 | 0 | 0 | 0 | 0 |
| 27.08.2020 02:00 - 03:00 | 0 | 0 | 0 | 0 |
| 27.08.2020 03:00 - 04:00 | 0 | 0 | 0 | 0 |
| 27.08.2020 04:00 - 05:00 | 0 | 0 | 0 | 0 |
| 27.08.2020 05:00 - 06:00 | 0 | 0 | 0 | 0 |
| 27.08.2020 06:00 - 07:00 | 0 | 0 | 0 | 0 |
| 27.08.2020 07:00 - 08:00 | 0 | 0 | 0 | 0 |
| 27.08.2020 08:00 - 09:00 | 0 | 0 | 0 | 0 |
| 27.08.2020 09:00 - 10:00 | 0 | 0 | 0 | 0 |
| 27.08.2020 10:00 - 11:00 | 0 | 0 | 0 | 0 |
| 27.08.2020 11:00 - 12:00 | 0 | 0 | 0 | 0 |
| 27.08.2020 12:00 - 13:00 | 0 | 0 | 0 | 0 |
| 27.08.2020 13:00 - 14:00 | 0 | 0 | 0 | 0 |
| 27.08.2020 14:00 - 15:00 | 0 | 0 | 0 | 0 |
| 27.08.2020 15:00 - 16:00 | 0 | 0 | 0 | 0 |
| 27.08.2020 16:00 - 17:00 | 0 | 0 | 0 | 0 |
| 27.08.2020 17:00 - 18:00 | 278 | 0 | 0 | 0 |
| 27.08.2020 18:00 - 19:00 | 300 | 0 | 0 | 0 |
| 27.08.2020 19:00 - 20:00 | 300 | 0 | 0 | 0 |
| 27.08.2020 20:00 - 21:00 | 300 | 0 | 0 | 0 |
| 27.08.2020 21:00 - 22:00 | 300 | 0 | 0 | 0 |
| 27.08.2020 22:00 - 23:00 | 300 | 0 | 0 | 0 |
| 27.08.2020 23:00 - 24:00 | 300 | 0 | 0 | 0 |
| 28.08.2020 00:00 - 01:00 | 300 | 0 | 0 | 0 |
| 28.08.2020 01:00 - 02:00 | 300 | 0 | 0 | 0 |
| 28.08.2020 02:00 - 03:00 | 300 | 0 | 0 | 0 |
| 28.08.2020 03:00 - 04:00 | 300 | 0 | 0 | 0 |
| 28.08.2020 04:00 - 05:00 | 300 | 0 | 0 | 0 |
| 28.08.2020 05:00 - 06:00 | 300 | 0 | 0 | 0 |
| 28.08.2020 06:00 - 07:00 | 0 | 0 | 0 | 0 |
| 28.08.2020 07:00 - 08:00 | 0 | 0 | 0 | 0 |
| 28.08.2020 08:00 - 09:00 | 0 | 0 | 0 | 0 |
| 28.08.2020 09:00 - 10:00 | 0 | 0 | 0 | 0 |
| 28.08.2020 10:00 - 11:00 | 0 | 0 | 0 | 0 |
| 28.08.2020 11:00 - 12:00 | 0 | 0 | 0 | 0 |
| 28.08.2020 12:00 - 13:00 | 100 | 0 | 0 | 0 |
| 28.08.2020 13:00 - 14:00 | 300 | 0 | 0 | 0 |
| 28.08.2020 14:00 - 15:00 | 300 | 0 | 0 | 0 |
| 28.08.2020 15:00 - 16:00 | 300 | 0 | 0 | 0 |
| 28.08.2020 16:00 - 17:00 | 300 | 0 | 0 | 0 |
| 28.08.2020 17:00 - 18:00 | 300 | 0 | 0 | 0 |
| 28.08.2020 18:00 - 19:00 | 300 | 0 | 0 | 0 |
| 28.08.2020 19:00 - 20:00 | 300 | 0 | 0 | 0 |
| 28.08.2020 20:00 - 21:00 | 300 | 0 | 0 | 0 |
| 28.08.2020 21:00 - 22:00 | 300 | 0 | 0 | 0 |
| 28.08.2020 22:00 - 23:00 | 300 | 0 | 0 | 0 |
| 28.08.2020 23:00 - 24:00 | 300 | 0 | 0 | 0 |
| 29.08.2020 00:00 - 01:00 | 300 | 0 | 0 | 0 |
| 29.08.2020 01:00 - 02:00 | 300 | 0 | 0 | 0 |
| 29.08.2020 02:00 - 03:00 | 300 | 0 | 0 | 0 |
| 29.08.2020 03:00 - 04:00 | 300 | 0 | 0 | 0 |
| 29.08.2020 04:00 - 05:00 | 300 | 0 | 0 | 0 |
| 29.08.2020 05:00 - 06:00 | 300 | 0 | 0 | 0 |
| 29.08.2020 06:00 - 07:00 | 0 | 0 | 0 | 0 |
| 29.08.2020 07:00 - 08:00 | 0 | 0 | 0 | 0 |
| 29.08.2020 08:00 - 09:00 | 0 | 0 | 0 | 0 |
| 29.08.2020 09:00 - 10:00 | 0 | 0 | 0 | 0 |
| 29.08.2020 10:00 - 11:00 | 0 | 0 | 0 | 0 |
| 29.08.2020 11:00 - 12:00 | 0 | 0 | 0 | 0 |
| 29.08.2020 12:00 - 13:00 | 0 | 0 | 0 | 0 |
| 29.08.2020 13:00 - 14:00 | 0 | 0 | 0 | 0 |
| 29.08.2020 14:00 - 15:00 | 0 | 0 | 0 | 0 |
| 29.08.2020 15:00 - 16:00 | 0 | 0 | 0 | 0 |
| 29.08.2020 16:00 - 17:00 | 0 | 0 | 0 | 0 |
| 29.08.2020 17:00 - 18:00 | 0 | 0 | 0 | 0 |
| 29.08.2020 18:00 - 19:00 | 0 | 0 | 0 | 0 |
| 29.08.2020 19:00 - 20:00 | 0 | 0 | 0 | 0 |
| 29.08.2020 20:00 - 21:00 | 0 | 0 | 0 | 0 |
| 29.08.2020 21:00 - 22:00 | 0 | 0 | 0 | 0 |
| 29.08.2020 22:00 - 23:00 | 0 | 0 | 0 | 0 |
| 29.08.2020 23:00 - 24:00 | 0 | 0 | 0 | 0 |
| 30.08.2020 00:00 - 01:00 | 0 | 0 | 0 | 0 |
| 30.08.2020 01:00 - 02:00 | 0 | 0 | 0 | 0 |
| 30.08.2020 02:00 - 03:00 | 0 | 0 | 0 | 0 |
| 30.08.2020 03:00 - 04:00 | 0 | 0 | 0 | 0 |
| 30.08.2020 04:00 - 05:00 | 0 | 0 | 0 | 0 |
| 30.08.2020 05:00 - 06:00 | 0 | 0 | 0 | 0 |
| 30.08.2020 06:00 - 07:00 | 0 | 0 | 0 | 0 |
| 30.08.2020 07:00 - 08:00 | 0 | 0 | 0 | 0 |
| 30.08.2020 08:00 - 09:00 | 0 | 0 | 0 | 0 |
| 30.08.2020 09:00 - 10:00 | 0 | 0 | 0 | 0 |
| 30.08.2020 10:00 - 11:00 | 0 | 0 | 0 | 0 |
| 30.08.2020 11:00 - 12:00 | 0 | 0 | 0 | 0 |
| 30.08.2020 12:00 - 13:00 | 0 | 0 | 0 | 0 |
| 30.08.2020 13:00 - 14:00 | 0 | 0 | 0 | 0 |
| 30.08.2020 14:00 - 15:00 | 0 | 0 | 0 | 0 |
| 30.08.2020 15:00 - 16:00 | 0 | 0 | 0 | 0 |
| 30.08.2020 16:00 - 17:00 | 0 | 0 | 0 | 0 |
| 30.08.2020 17:00 - 18:00 | 0 | 0 | 0 | 0 |
| 30.08.2020 18:00 - 19:00 | 0 | 0 | 0 | 0 |
| 30.08.2020 19:00 - 20:00 | 0 | 0 | 0 | 0 |
| 30.08.2020 20:00 - 21:00 | 0 | 0 | 0 | 0 |
| 30.08.2020 21:00 - 22:00 | 0 | 0 | 0 | 0 |
| 30.08.2020 22:00 - 23:00 | 0 | 0 | 0 | 0 |
| 30.08.2020 23:00 - 24:00 | 0 | 0 | 0 | 0 |
| 31.08.2020 00:00 - 01:00 | 0 | 0 | 0 | 0 |
| 31.08.2020 01:00 - 02:00 | 0 | 0 | 0 | 0 |
| 31.08.2020 02:00 - 03:00 | 0 | 0 | 0 | 0 |
| 31.08.2020 03:00 - 04:00 | 0 | 0 | 0 | 0 |
| 31.08.2020 04:00 - 05:00 | 0 | 0 | 0 | 0 |
| 31.08.2020 05:00 - 06:00 | 0 | 0 | 0 | 0 |
| 31.08.2020 06:00 - 07:00 | 0 | 0 | 0 | 0 |
| 31.08.2020 07:00 - 08:00 | 0 | 0 | 0 | 0 |
| 31.08.2020 08:00 - 09:00 | 0 | 0 | 0 | 0 |
| 31.08.2020 09:00 - 10:00 | 0 | 0 | 0 | 0 |
| 31.08.2020 10:00 - 11:00 | 0 | 0 | 0 | 0 |
| 31.08.2020 11:00 - 12:00 | 0 | 0 | 0 | 0 |
| 31.08.2020 12:00 - 13:00 | 0 | 0 | 0 | 0 |
| 31.08.2020 13:00 - 14:00 | 0 | 0 | 0 | 0 |
| 31.08.2020 14:00 - 15:00 | 0 | 0 | 0 | 0 |
| 31.08.2020 15:00 - 16:00 | 0 | 0 | 0 | 0 |
| 31.08.2020 16:00 - 17:00 | 0 | 0 | 0 | 0 |
| 31.08.2020 17:00 - 18:00 | 0 | 0 | 0 | 0 |
| 31.08.2020 18:00 - 19:00 | 0 | 0 | 0 | 0 |
| 31.08.2020 19:00 - 20:00 | 0 | 0 | 0 | 0 |
| 31.08.2020 20:00 - 21:00 | 0 | 0 | 0 | 0 |
| 31.08.2020 21:00 - 22:00 | 0 | 0 | 0 | 0 |
| 31.08.2020 22:00 - 23:00 | 0 | 0 | 0 | 0 |
| 31.08.2020 23:00 - 24:00 | 0 | 0 | 0 | 0 |
| 01.09.2020 00:00 - 01:00 | 0 | 0 | 0 | 0 |
| 01.09.2020 01:00 - 02:00 | 0 | 0 | 0 | 0 |
| 01.09.2020 02:00 - 03:00 | 800 | 0 | 0 | 0 |
| 01.09.2020 03:00 - 04:00 | 800 | 0 | 0 | 0 |
| 01.09.2020 04:00 - 05:00 | 800 | 0 | 0 | 0 |
| 01.09.2020 05:00 - 06:00 | 800 | 0 | 0 | 0 |